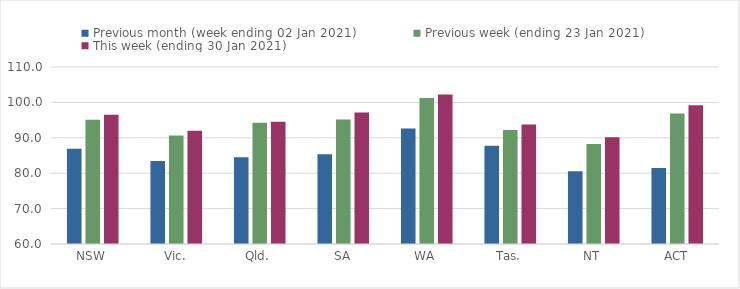
| Category | Previous month (week ending 02 Jan 2021) | Previous week (ending 23 Jan 2021) | This week (ending 30 Jan 2021) |
|---|---|---|---|
| NSW | 86.91 | 95.09 | 96.48 |
| Vic. | 83.47 | 90.68 | 92 |
| Qld. | 84.54 | 94.22 | 94.51 |
| SA | 85.34 | 95.14 | 97.12 |
| WA | 92.62 | 101.25 | 102.2 |
| Tas. | 87.72 | 92.2 | 93.75 |
| NT | 80.53 | 88.28 | 90.18 |
| ACT | 81.45 | 96.83 | 99.19 |